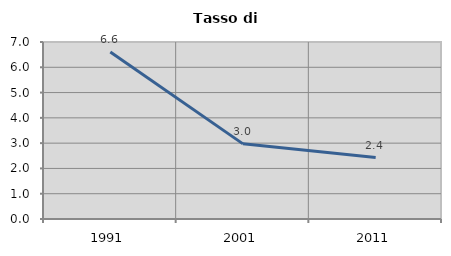
| Category | Tasso di disoccupazione   |
|---|---|
| 1991.0 | 6.604 |
| 2001.0 | 2.972 |
| 2011.0 | 2.431 |